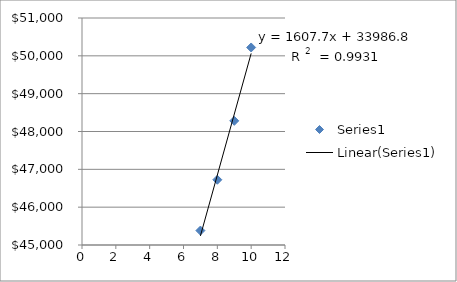
| Category | Series 0 |
|---|---|
| 7.0 | 45381 |
| 8.0 | 46725 |
| 9.0 | 48282 |
| 10.0 | 50221 |